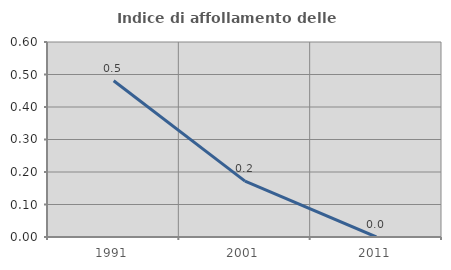
| Category | Indice di affollamento delle abitazioni  |
|---|---|
| 1991.0 | 0.481 |
| 2001.0 | 0.172 |
| 2011.0 | 0 |